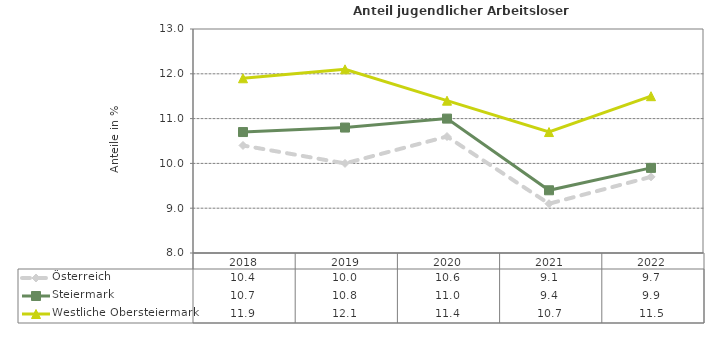
| Category | Österreich | Steiermark | Westliche Obersteiermark |
|---|---|---|---|
| 2022.0 | 9.7 | 9.9 | 11.5 |
| 2021.0 | 9.1 | 9.4 | 10.7 |
| 2020.0 | 10.6 | 11 | 11.4 |
| 2019.0 | 10 | 10.8 | 12.1 |
| 2018.0 | 10.4 | 10.7 | 11.9 |